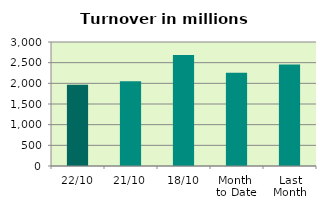
| Category | Series 0 |
|---|---|
| 22/10 | 1963.017 |
| 21/10 | 2050.728 |
| 18/10 | 2682.724 |
| Month 
to Date | 2255.923 |
| Last
Month | 2458.207 |